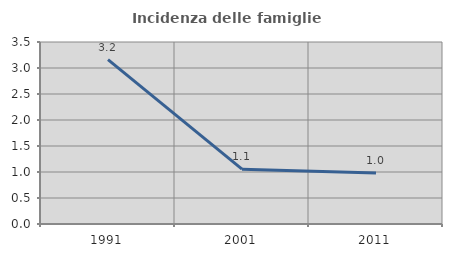
| Category | Incidenza delle famiglie numerose |
|---|---|
| 1991.0 | 3.161 |
| 2001.0 | 1.054 |
| 2011.0 | 0.981 |